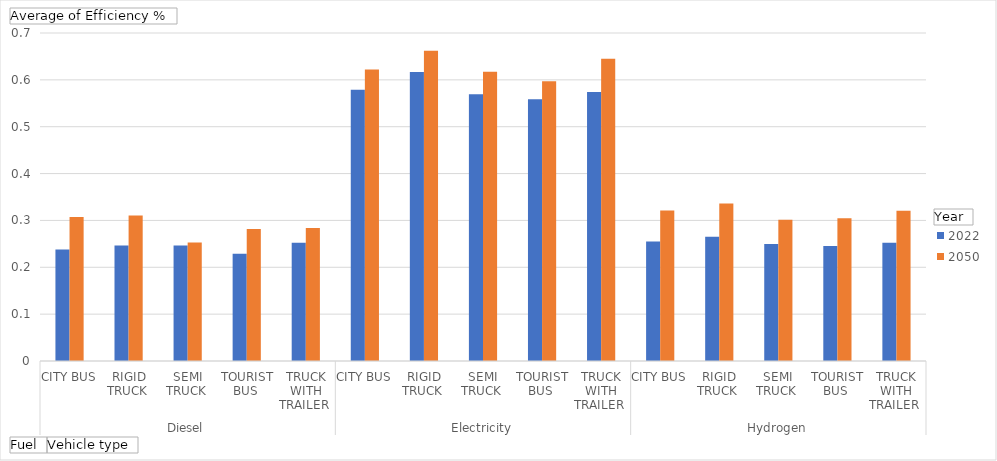
| Category | 2022 | 2050 |
|---|---|---|
| 0 | 0.238 | 0.308 |
| 1 | 0.247 | 0.311 |
| 2 | 0.246 | 0.253 |
| 3 | 0.229 | 0.282 |
| 4 | 0.252 | 0.284 |
| 5 | 0.579 | 0.622 |
| 6 | 0.617 | 0.662 |
| 7 | 0.569 | 0.617 |
| 8 | 0.559 | 0.597 |
| 9 | 0.574 | 0.645 |
| 10 | 0.255 | 0.321 |
| 11 | 0.265 | 0.336 |
| 12 | 0.249 | 0.301 |
| 13 | 0.245 | 0.305 |
| 14 | 0.252 | 0.321 |